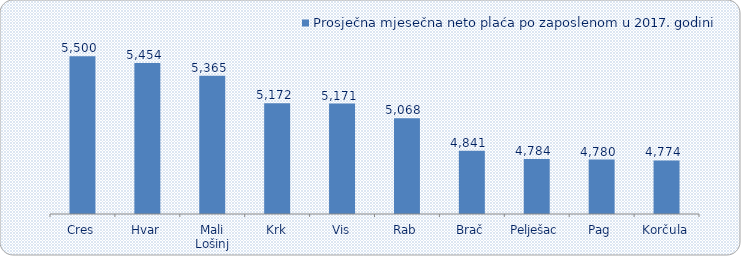
| Category | Prosječna mjesečna neto plaća po zaposlenom u 2017. godini |
|---|---|
| Cres | 5500.112 |
| Hvar | 5453.506 |
| Mali Lošinj | 5364.699 |
| Krk | 5172.127 |
| Vis | 5170.508 |
| Rab | 5068.396 |
| Brač | 4841.316 |
| Pelješac | 4783.925 |
| Pag | 4779.5 |
| Korčula | 4773.912 |